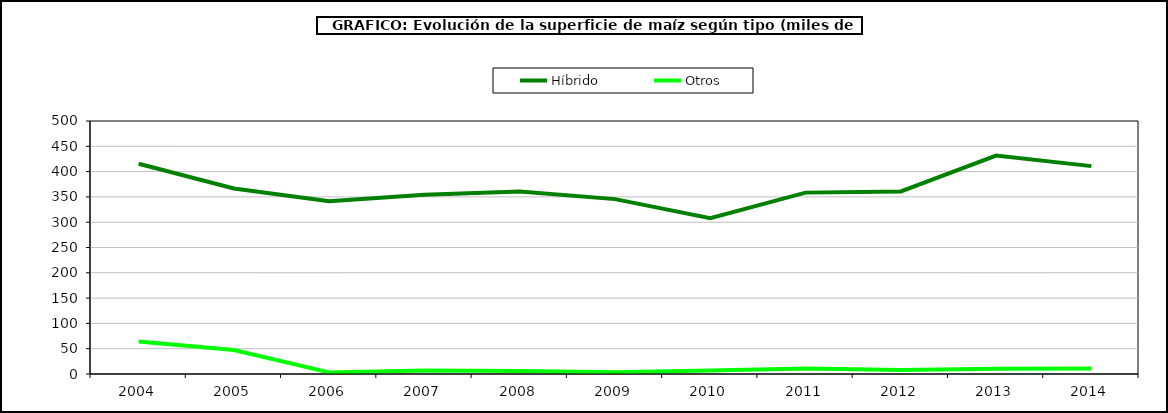
| Category | Híbrido | Otros |
|---|---|---|
| 2004.0 | 415.396 | 64.405 |
| 2005.0 | 366.766 | 47.532 |
| 2006.0 | 341.193 | 3.207 |
| 2007.0 | 354.133 | 6.865 |
| 2008.0 | 360.764 | 5.72 |
| 2009.0 | 345.605 | 3.344 |
| 2010.0 | 307.927 | 7.063 |
| 2011.0 | 358.45 | 10.814 |
| 2012.0 | 360.837 | 7.917 |
| 2013.0 | 431.742 | 10.556 |
| 2014.0 | 410.83 | 10.775 |